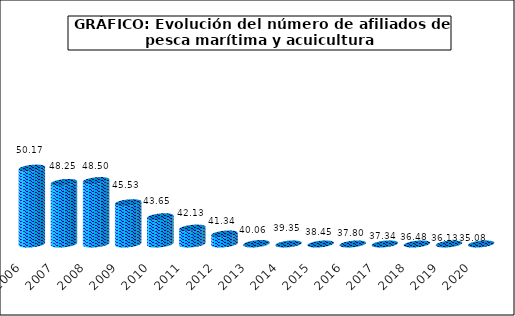
| Category | Series1 |
|---|---|
| 2006.0 | 50.17 |
| 2007.0 | 48.25 |
| 2008.0 | 48.5 |
| 2009.0 | 45.53 |
| 2010.0 | 43.65 |
| 2011.0 | 42.13 |
| 2012.0 | 41.34 |
| 2013.0 | 40.06 |
| 2014.0 | 39.35 |
| 2015.0 | 38.45 |
| 2016.0 | 37.8 |
| 2017.0 | 37.34 |
| 2018.0 | 36.48 |
| 2019.0 | 36.132 |
| 2020.0 | 35.084 |